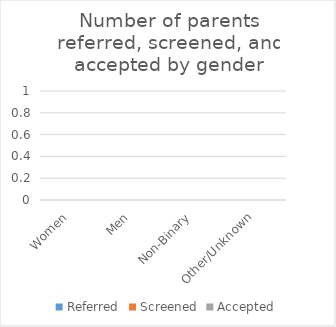
| Category | Referred | Screened | Accepted |
|---|---|---|---|
| Women | 0 | 0 | 0 |
| Men | 0 | 0 | 0 |
| Non-Binary | 0 | 0 | 0 |
| Other/Unknown | 0 | 0 | 0 |